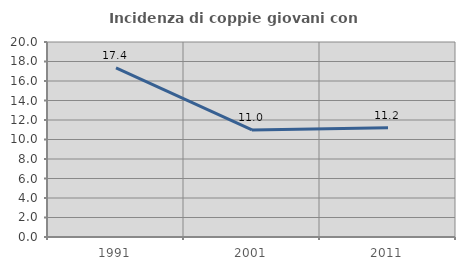
| Category | Incidenza di coppie giovani con figli |
|---|---|
| 1991.0 | 17.356 |
| 2001.0 | 10.976 |
| 2011.0 | 11.216 |